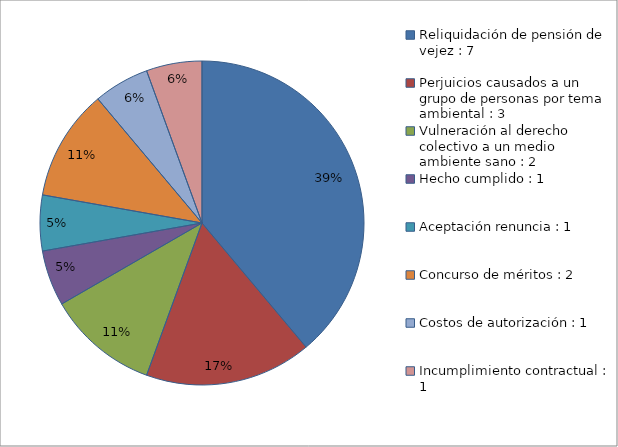
| Category | Series 0 |
|---|---|
| Reliquidación de pensión de vejez : 7 | 7 |
| Perjuicios causados a un grupo de personas por tema ambiental : 3 | 3 |
| Vulneración al derecho colectivo a un medio ambiente sano : 2 | 2 |
| Hecho cumplido : 1 | 1 |
| Aceptación renuncia : 1 | 1 |
| Concurso de méritos : 2 | 2 |
| Costos de autorización : 1 | 1 |
| Incumplimiento contractual : 1 | 1 |